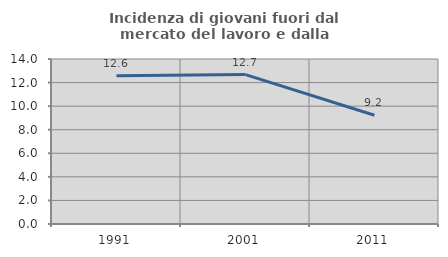
| Category | Incidenza di giovani fuori dal mercato del lavoro e dalla formazione  |
|---|---|
| 1991.0 | 12.584 |
| 2001.0 | 12.676 |
| 2011.0 | 9.225 |